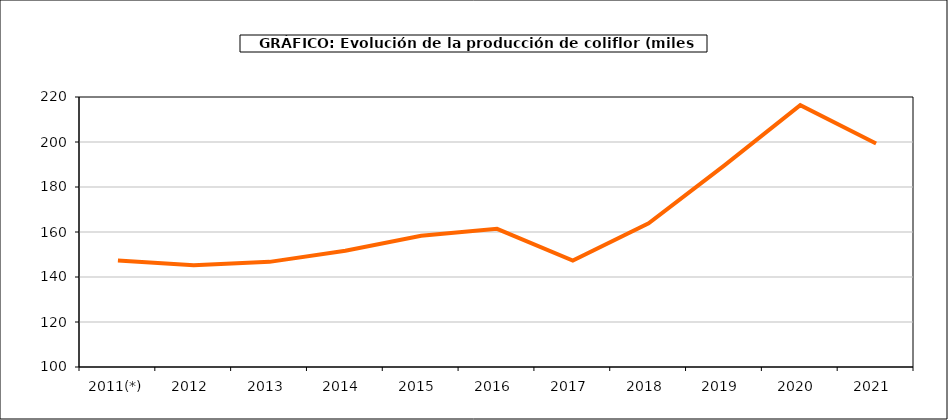
| Category | producción |
|---|---|
| 2011(*) | 147.3 |
| 2012  | 145.268 |
| 2013  | 146.724 |
| 2014  | 151.651 |
| 2015  | 158.34 |
| 2016  | 161.424 |
| 2017  | 147.33 |
| 2018  | 163.868 |
| 2019  | 189.638 |
| 2020  | 216.389 |
| 2021  | 199.331 |